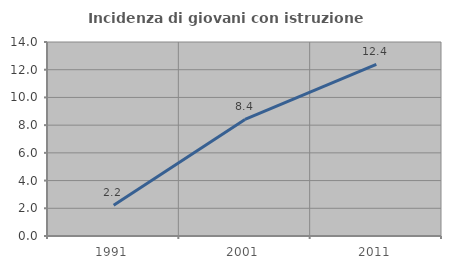
| Category | Incidenza di giovani con istruzione universitaria |
|---|---|
| 1991.0 | 2.222 |
| 2001.0 | 8.411 |
| 2011.0 | 12.381 |